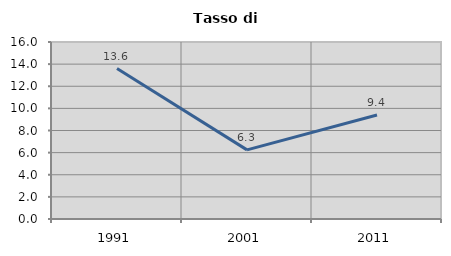
| Category | Tasso di disoccupazione   |
|---|---|
| 1991.0 | 13.6 |
| 2001.0 | 6.25 |
| 2011.0 | 9.404 |